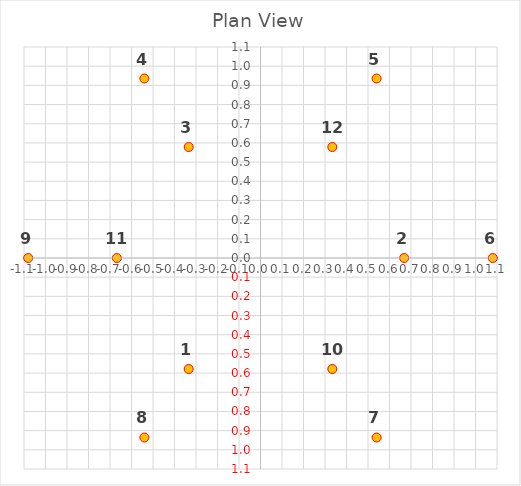
| Category | Series 0 |
|---|---|
| -0.33405671184780805 | -0.579 |
| 0.6681134236956155 | 0 |
| -0.3340567118478076 | 0.579 |
| -0.5402579879007786 | 0.936 |
| 0.540257987900779 | 0.936 |
| 1.0805159758015577 | 0 |
| 0.540257987900779 | -0.936 |
| -0.5402579879007793 | -0.936 |
| -1.0805159758015577 | 0 |
| 0.33405671184780783 | -0.579 |
| -0.6681134236956155 | 0 |
| 0.33405671184780783 | 0.579 |